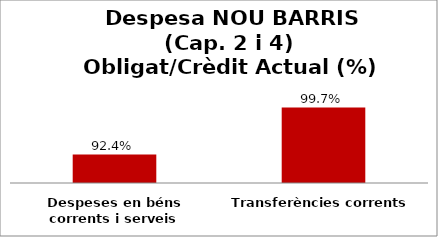
| Category | Series 0 |
|---|---|
| Despeses en béns corrents i serveis | 0.924 |
| Transferències corrents | 0.997 |